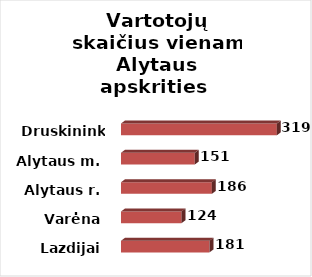
| Category | Series 0 |
|---|---|
| Lazdijai | 181 |
| Varėna | 124 |
| Alytaus r. | 186 |
| Alytaus m. | 151 |
| Druskininkai | 319 |